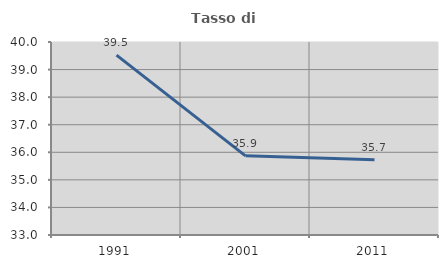
| Category | Tasso di occupazione   |
|---|---|
| 1991.0 | 39.525 |
| 2001.0 | 35.871 |
| 2011.0 | 35.733 |